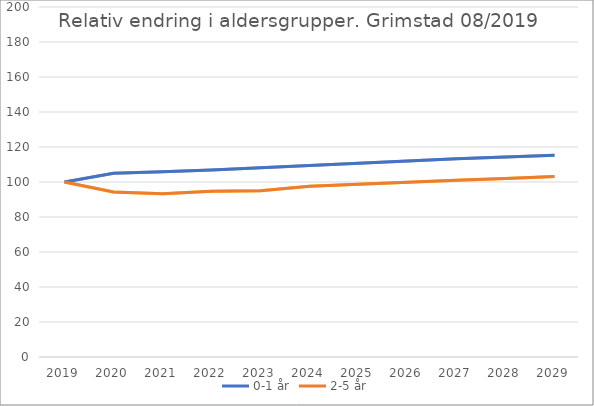
| Category | 0-1 år | 2-5 år |
|---|---|---|
| 2019 | 100 | 100 |
| 2020 | 104.962 | 94.303 |
| 2021 | 105.822 | 93.292 |
| 2022 | 106.901 | 94.657 |
| 2023 | 108.13 | 95.004 |
| 2024 | 109.422 | 97.632 |
| 2025 | 110.738 | 98.722 |
| 2026 | 112.022 | 99.856 |
| 2027 | 113.243 | 100.987 |
| 2028 | 114.35 | 102.064 |
| 2029 | 115.336 | 103.075 |